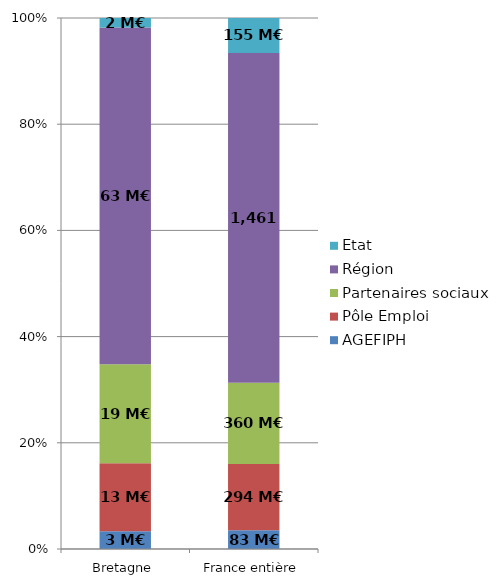
| Category | AGEFIPH | Pôle Emploi | Partenaires sociaux | Région | Etat |
|---|---|---|---|---|---|
| Bretagne | 3.336 | 12.693 | 18.506 | 62.929 | 1.774 |
| France entière | 82.716 | 293.959 | 359.593 | 1461.057 | 154.74 |